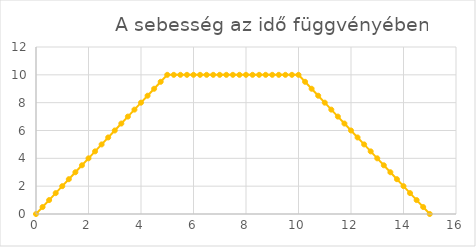
| Category | Series 0 |
|---|---|
| 0.0 | 0 |
| 0.25 | 0.5 |
| 0.5 | 1 |
| 0.75 | 1.5 |
| 1.0 | 2 |
| 1.25 | 2.5 |
| 1.5 | 3 |
| 1.75 | 3.5 |
| 2.0 | 4 |
| 2.25 | 4.5 |
| 2.5 | 5 |
| 2.75 | 5.5 |
| 3.0 | 6 |
| 3.25 | 6.5 |
| 3.5 | 7 |
| 3.75 | 7.5 |
| 4.0 | 8 |
| 4.25 | 8.5 |
| 4.5 | 9 |
| 4.75 | 9.5 |
| 5.0 | 10 |
| 5.25 | 10 |
| 5.5 | 10 |
| 5.75 | 10 |
| 6.0 | 10 |
| 6.25 | 10 |
| 6.5 | 10 |
| 6.75 | 10 |
| 7.0 | 10 |
| 7.25 | 10 |
| 7.5 | 10 |
| 7.75 | 10 |
| 8.0 | 10 |
| 8.25 | 10 |
| 8.5 | 10 |
| 8.75 | 10 |
| 9.0 | 10 |
| 9.25 | 10 |
| 9.5 | 10 |
| 9.75 | 10 |
| 10.0 | 10 |
| 10.25 | 9.5 |
| 10.5 | 9 |
| 10.75 | 8.5 |
| 11.0 | 8 |
| 11.25 | 7.5 |
| 11.5 | 7 |
| 11.75 | 6.5 |
| 12.0 | 6 |
| 12.25 | 5.5 |
| 12.5 | 5 |
| 12.75 | 4.5 |
| 13.0 | 4 |
| 13.25 | 3.5 |
| 13.5 | 3 |
| 13.75 | 2.5 |
| 14.0 | 2 |
| 14.25 | 1.5 |
| 14.5 | 1 |
| 14.75 | 0.5 |
| 15.0 | 0 |